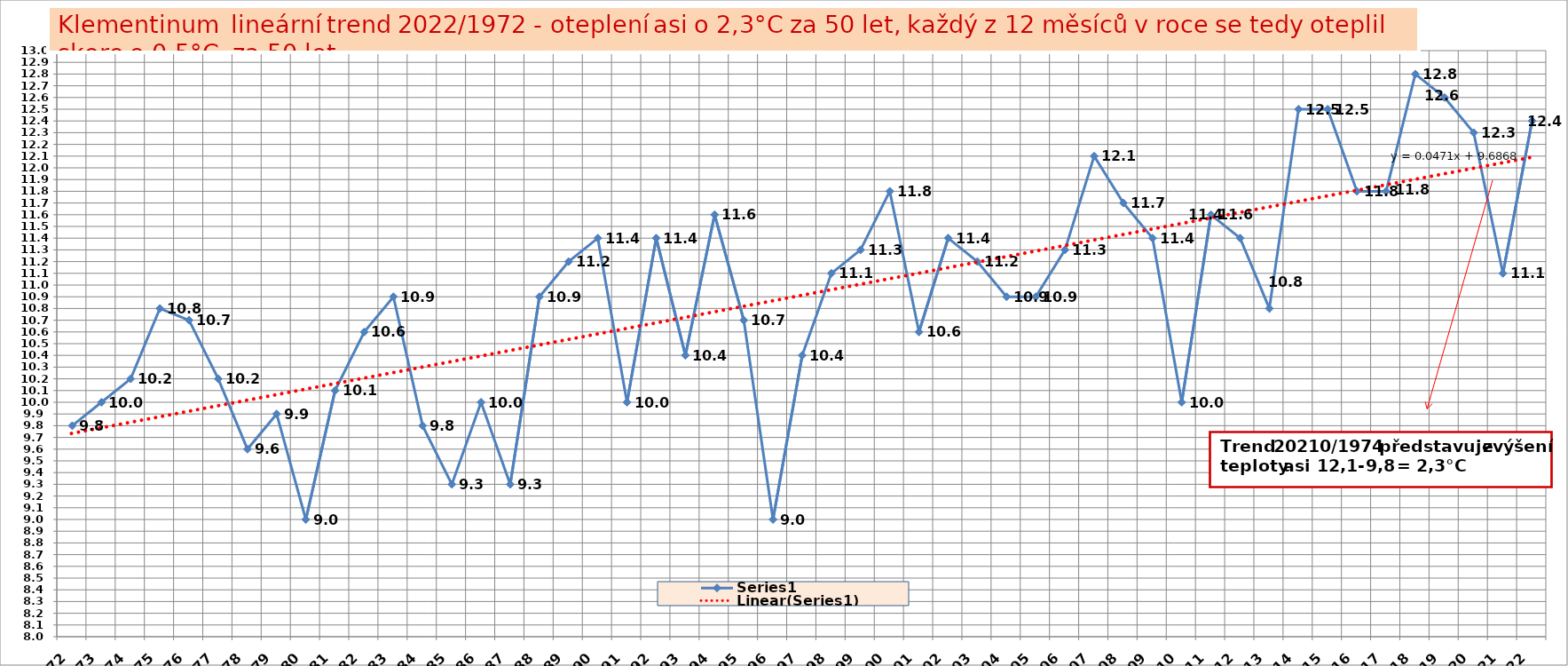
| Category | Series 0 |
|---|---|
| 1972 | 9.8 |
| 1973 | 10 |
| 1974 | 10.2 |
| 1975 | 10.8 |
| 1976 | 10.7 |
| 1977 | 10.2 |
| 1978 | 9.6 |
| 1979 | 9.9 |
| 1980 | 9 |
| 1981 | 10.1 |
| 1982 | 10.6 |
| 1983 | 10.9 |
| 1984 | 9.8 |
| 1985 | 9.3 |
| 1986 | 10 |
| 1987 | 9.3 |
| 1988 | 10.9 |
| 1989 | 11.2 |
| 1990 | 11.4 |
| 1991 | 10 |
| 1992 | 11.4 |
| 1993 | 10.4 |
| 1994 | 11.6 |
| 1995 | 10.7 |
| 1996 | 9 |
| 1997 | 10.4 |
| 1998 | 11.1 |
| 1999 | 11.3 |
| 2000 | 11.8 |
| 2001 | 10.6 |
| 2002 | 11.4 |
| 2003 | 11.2 |
| 2004 | 10.9 |
| 2005 | 10.9 |
| 2006 | 11.3 |
| 2007 | 12.1 |
| 2008 | 11.7 |
| 2009 | 11.4 |
| 2010 | 10 |
| 2011 | 11.6 |
| 2012 | 11.4 |
| 2013 | 10.8 |
| 2014 | 12.5 |
| 2015 | 12.5 |
| 2016 | 11.8 |
| 2017 | 11.8 |
| 2018 | 12.8 |
| 2019 | 12.6 |
| 2020 | 12.3 |
| 2021 | 11.1 |
| 2022 | 12.4 |